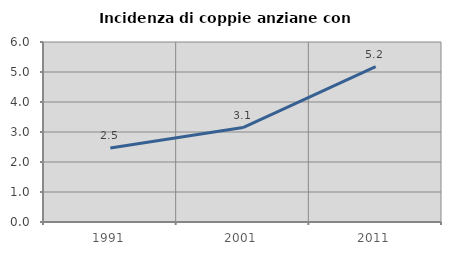
| Category | Incidenza di coppie anziane con figli |
|---|---|
| 1991.0 | 2.469 |
| 2001.0 | 3.15 |
| 2011.0 | 5.179 |